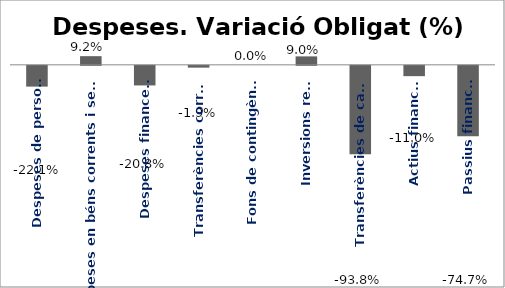
| Category | Series 0 |
|---|---|
| Despeses de personal | -0.221 |
| Despeses en béns corrents i serveis | 0.092 |
| Despeses financeres | -0.208 |
| Transferències corrents | -0.019 |
| Fons de contingència | 0 |
| Inversions reals | 0.09 |
| Transferències de capital | -0.938 |
| Actius financers | -0.11 |
| Passius financers | -0.747 |